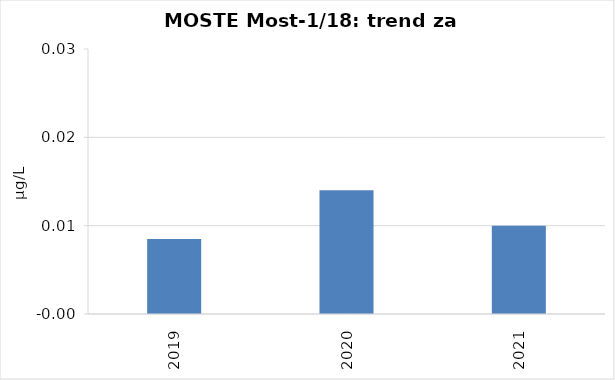
| Category | Vsota |
|---|---|
| 2019 | 0.008 |
| 2020 | 0.014 |
| 2021 | 0.01 |